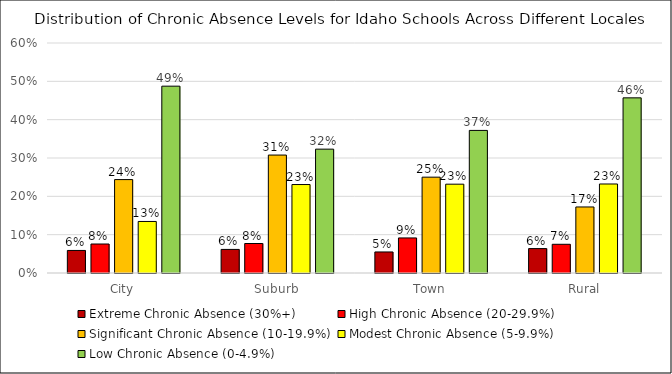
| Category | Extreme Chronic Absence (30%+) | High Chronic Absence (20-29.9%) | Significant Chronic Absence (10-19.9%) | Modest Chronic Absence (5-9.9%) | Low Chronic Absence (0-4.9%) |
|---|---|---|---|---|---|
| City | 0.059 | 0.076 | 0.244 | 0.134 | 0.487 |
| Suburb | 0.062 | 0.077 | 0.308 | 0.231 | 0.323 |
| Town | 0.055 | 0.091 | 0.25 | 0.232 | 0.372 |
| Rural | 0.064 | 0.075 | 0.172 | 0.232 | 0.457 |